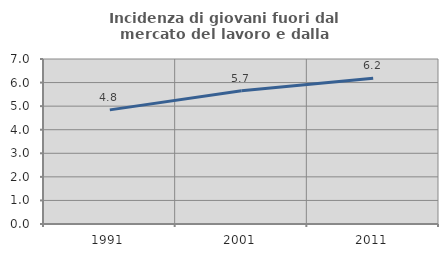
| Category | Incidenza di giovani fuori dal mercato del lavoro e dalla formazione  |
|---|---|
| 1991.0 | 4.842 |
| 2001.0 | 5.656 |
| 2011.0 | 6.183 |